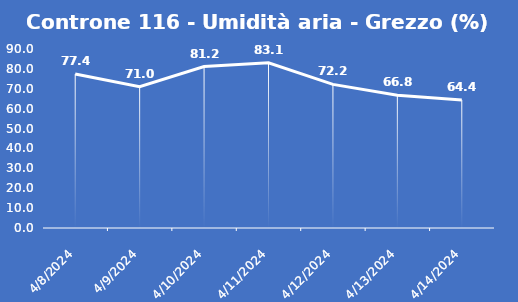
| Category | Controne 116 - Umidità aria - Grezzo (%) |
|---|---|
| 4/8/24 | 77.4 |
| 4/9/24 | 71 |
| 4/10/24 | 81.2 |
| 4/11/24 | 83.1 |
| 4/12/24 | 72.2 |
| 4/13/24 | 66.8 |
| 4/14/24 | 64.4 |